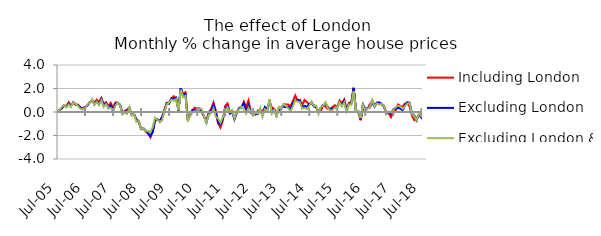
| Category | Including London | Excluding London | Excluding London & SE |
|---|---|---|---|
| 2005-07-01 | 0.004 | -0.027 | 0.069 |
| 2005-08-01 | 0.128 | 0.163 | 0.113 |
| 2005-09-01 | 0.297 | 0.295 | 0.421 |
| 2005-10-01 | 0.584 | 0.545 | 0.585 |
| 2005-11-01 | 0.486 | 0.433 | 0.401 |
| 2005-12-01 | 0.828 | 0.713 | 0.635 |
| 2006-01-01 | 0.509 | 0.504 | 0.432 |
| 2006-02-01 | 0.838 | 0.808 | 0.823 |
| 2006-03-01 | 0.586 | 0.674 | 0.681 |
| 2006-04-01 | 0.628 | 0.563 | 0.509 |
| 2006-05-01 | 0.405 | 0.361 | 0.266 |
| 2006-06-01 | 0.306 | 0.233 | 0.241 |
| 2006-07-01 | 0.429 | 0.392 | 0.321 |
| 2006-08-01 | 0.565 | 0.554 | 0.633 |
| 2006-09-01 | 0.835 | 0.786 | 0.762 |
| 2006-10-01 | 0.993 | 1.028 | 1.077 |
| 2006-11-01 | 0.798 | 0.657 | 0.597 |
| 2006-12-01 | 1.047 | 0.896 | 0.873 |
| 2007-01-01 | 0.861 | 0.675 | 0.579 |
| 2007-02-01 | 1.212 | 1.103 | 1.006 |
| 2007-03-01 | 0.649 | 0.564 | 0.427 |
| 2007-04-01 | 0.826 | 0.759 | 0.678 |
| 2007-05-01 | 0.491 | 0.363 | 0.375 |
| 2007-06-01 | 0.782 | 0.561 | 0.366 |
| 2007-07-01 | 0.32 | 0.1 | 0.07 |
| 2007-08-01 | 0.81 | 0.683 | 0.526 |
| 2007-09-01 | 0.786 | 0.789 | 0.799 |
| 2007-10-01 | 0.574 | 0.623 | 0.585 |
| 2007-11-01 | -0.113 | -0.077 | -0.206 |
| 2007-12-01 | 0.076 | 0.042 | -0.036 |
| 2008-01-01 | 0.196 | 0.057 | -0.181 |
| 2008-02-01 | 0.402 | 0.318 | 0.4 |
| 2008-03-01 | -0.271 | -0.253 | -0.302 |
| 2008-04-01 | -0.188 | -0.2 | -0.142 |
| 2008-05-01 | -0.619 | -0.654 | -0.845 |
| 2008-06-01 | -0.782 | -0.813 | -0.776 |
| 2008-07-01 | -1.451 | -1.459 | -1.469 |
| 2008-08-01 | -1.382 | -1.399 | -1.373 |
| 2008-09-01 | -1.671 | -1.607 | -1.657 |
| 2008-10-01 | -1.826 | -1.814 | -1.615 |
| 2008-11-01 | -2.159 | -2.057 | -1.722 |
| 2008-12-01 | -1.562 | -1.704 | -1.276 |
| 2009-01-01 | -0.738 | -0.696 | -0.476 |
| 2009-02-01 | -0.617 | -0.629 | -0.663 |
| 2009-03-01 | -0.835 | -0.775 | -0.813 |
| 2009-04-01 | -0.421 | -0.427 | -0.719 |
| 2009-05-01 | 0.239 | 0.032 | 0.055 |
| 2009-06-01 | 0.777 | 0.768 | 0.66 |
| 2009-07-01 | 0.802 | 0.701 | 0.8 |
| 2009-08-01 | 1.131 | 1.168 | 1.054 |
| 2009-09-01 | 1.337 | 1.113 | 0.972 |
| 2009-10-01 | 1.165 | 1.217 | 1.097 |
| 2009-11-01 | 0.197 | 0.118 | 0.156 |
| 2009-12-01 | 1.981 | 2.035 | 1.897 |
| 2010-01-01 | 1.519 | 1.363 | 1.249 |
| 2010-02-01 | 1.677 | 1.52 | 1.375 |
| 2010-03-01 | -0.627 | -0.692 | -0.795 |
| 2010-04-01 | -0.325 | -0.232 | -0.266 |
| 2010-05-01 | 0.094 | 0.19 | -0.033 |
| 2010-06-01 | 0.367 | 0.159 | 0.081 |
| 2010-07-01 | 0.291 | 0.119 | -0.034 |
| 2010-08-01 | 0.34 | 0.264 | 0.318 |
| 2010-09-01 | -0.022 | 0.097 | 0.241 |
| 2010-10-01 | -0.376 | -0.435 | -0.41 |
| 2010-11-01 | -0.713 | -0.899 | -0.896 |
| 2010-12-01 | 0.005 | -0.185 | -0.217 |
| 2011-01-01 | 0.246 | 0.156 | -0.125 |
| 2011-02-01 | 0.789 | 0.605 | 0.302 |
| 2011-03-01 | 0.128 | -0.038 | -0.411 |
| 2011-04-01 | -0.968 | -0.9 | -0.557 |
| 2011-05-01 | -1.323 | -1.037 | -0.907 |
| 2011-06-01 | -0.728 | -0.567 | -0.453 |
| 2011-07-01 | 0.512 | 0.242 | 0.099 |
| 2011-08-01 | 0.726 | 0.47 | 0.393 |
| 2011-09-01 | -0.007 | -0.138 | -0.009 |
| 2011-10-01 | 0.137 | 0.027 | 0.156 |
| 2011-11-01 | -0.567 | -0.635 | -0.55 |
| 2011-12-01 | 0.039 | -0.073 | 0.07 |
| 2012-01-01 | 0.326 | 0.325 | 0.217 |
| 2012-02-01 | 0.35 | 0.447 | 0.451 |
| 2012-03-01 | 0.876 | 0.755 | 0.302 |
| 2012-04-01 | 0.41 | 0.073 | -0.137 |
| 2012-05-01 | 0.988 | 0.555 | 0.346 |
| 2012-06-01 | 0.006 | -0.081 | 0.004 |
| 2012-07-01 | -0.085 | -0.158 | -0.308 |
| 2012-08-01 | -0.229 | -0.157 | -0.058 |
| 2012-09-01 | 0.128 | -0.186 | -0.139 |
| 2012-10-01 | 0.179 | 0.172 | 0.344 |
| 2012-11-01 | 0.065 | -0.249 | -0.418 |
| 2012-12-01 | 0.317 | 0.405 | 0.234 |
| 2013-01-01 | 0.353 | 0.115 | 0.095 |
| 2013-02-01 | 0.856 | 0.948 | 1.094 |
| 2013-03-01 | 0.386 | 0.079 | -0.146 |
| 2013-04-01 | 0.274 | 0.196 | 0.178 |
| 2013-05-01 | -0.099 | -0.23 | -0.468 |
| 2013-06-01 | 0.123 | 0.165 | 0.449 |
| 2013-07-01 | 0.372 | 0.338 | 0.307 |
| 2013-08-01 | 0.658 | 0.477 | 0.683 |
| 2013-09-01 | 0.643 | 0.413 | 0.532 |
| 2013-10-01 | 0.632 | 0.433 | 0.308 |
| 2013-11-01 | 0.471 | 0.192 | 0.067 |
| 2013-12-01 | 0.925 | 0.764 | 0.46 |
| 2014-01-01 | 1.406 | 1.032 | 0.997 |
| 2014-02-01 | 0.988 | 1.004 | 0.876 |
| 2014-03-01 | 1.041 | 0.92 | 0.836 |
| 2014-04-01 | 0.572 | 0.382 | 0.28 |
| 2014-05-01 | 1.019 | 0.524 | 0.359 |
| 2014-06-01 | 0.845 | 0.427 | 0.25 |
| 2014-07-01 | 0.633 | 0.685 | 0.514 |
| 2014-08-01 | 0.738 | 0.819 | 0.897 |
| 2014-09-01 | 0.591 | 0.475 | 0.536 |
| 2014-10-01 | 0.374 | 0.403 | 0.543 |
| 2014-11-01 | 0.005 | -0.008 | -0.158 |
| 2014-12-01 | 0.104 | 0.388 | 0.438 |
| 2015-01-01 | 0.566 | 0.596 | 0.531 |
| 2015-02-01 | 0.477 | 0.712 | 0.845 |
| 2015-03-01 | 0.246 | 0.42 | 0.32 |
| 2015-04-01 | 0.268 | 0.15 | 0.11 |
| 2015-05-01 | 0.427 | 0.324 | 0.171 |
| 2015-06-01 | 0.575 | 0.356 | 0.37 |
| 2015-07-01 | 0.419 | 0.456 | 0.42 |
| 2015-08-01 | 0.978 | 0.742 | 0.82 |
| 2015-09-01 | 0.752 | 0.658 | 0.479 |
| 2015-10-01 | 1.06 | 0.93 | 0.809 |
| 2015-11-01 | 0.234 | 0.111 | -0.034 |
| 2015-12-01 | 0.779 | 0.71 | 0.654 |
| 2016-01-01 | 0.813 | 0.679 | 0.611 |
| 2016-02-01 | 2.068 | 2.04 | 1.776 |
| 2016-03-01 | 0.187 | 0.064 | 0.072 |
| 2016-04-01 | -0.005 | 0.068 | 0.11 |
| 2016-05-01 | -0.701 | -0.612 | -0.52 |
| 2016-06-01 | 0.306 | 0.646 | 0.59 |
| 2016-07-01 | 0.133 | 0.264 | 0.142 |
| 2016-08-01 | 0.302 | 0.34 | 0.298 |
| 2016-09-01 | 0.654 | 0.381 | 0.399 |
| 2016-10-01 | 0.961 | 0.856 | 1.037 |
| 2016-11-01 | 0.631 | 0.45 | 0.474 |
| 2016-12-01 | 0.74 | 0.805 | 0.726 |
| 2017-01-01 | 0.815 | 0.79 | 0.63 |
| 2017-02-01 | 0.634 | 0.713 | 0.692 |
| 2017-03-01 | 0.544 | 0.434 | 0.49 |
| 2017-04-01 | -0.045 | -0.156 | -0.138 |
| 2017-05-01 | -0.083 | -0.008 | 0.035 |
| 2017-06-01 | -0.443 | -0.155 | -0.055 |
| 2017-07-01 | -0.09 | 0.173 | 0.24 |
| 2017-08-01 | 0.116 | 0.298 | 0.401 |
| 2017-09-01 | 0.637 | 0.353 | 0.52 |
| 2017-10-01 | 0.515 | 0.288 | 0.49 |
| 2017-11-01 | 0.447 | 0.137 | 0.267 |
| 2017-12-01 | 0.713 | 0.597 | 0.506 |
| 2018-01-01 | 0.793 | 0.822 | 0.72 |
| 2018-02-01 | 0.445 | 0.783 | 0.744 |
| 2018-03-01 | -0.301 | -0.13 | -0.165 |
| 2018-04-01 | -0.698 | -0.311 | -0.381 |
| 2018-05-01 | -0.516 | -0.724 | -0.705 |
| 2018-06-01 | -0.227 | -0.166 | -0.077 |
| 2018-07-01 | -0.102 | -0.482 | -0.359 |
| 2018-08-01 | 0.015 | -0.104 | -0.035 |
| 2018-09-01 | -0.137 | -0.305 | -0.233 |